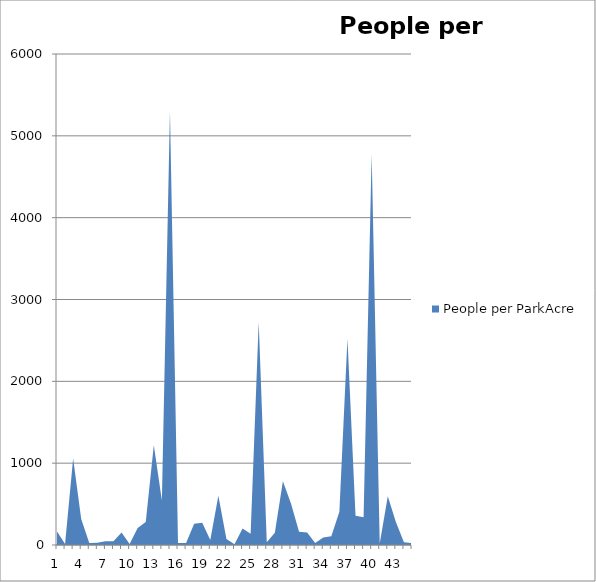
| Category | People per ParkAcre |
|---|---|
| 0 | 166.222 |
| 1 | 11.715 |
| 2 | 1057.923 |
| 3 | 316.927 |
| 4 | 24.488 |
| 5 | 26.723 |
| 6 | 46.502 |
| 7 | 45.991 |
| 8 | 151.634 |
| 9 | 11.04 |
| 10 | 206.359 |
| 11 | 279.823 |
| 12 | 1219.077 |
| 13 | 543.182 |
| 14 | 5302.315 |
| 15 | 23.995 |
| 16 | 23.17 |
| 17 | 261.053 |
| 18 | 270.855 |
| 19 | 59.758 |
| 20 | 602.741 |
| 21 | 73.906 |
| 22 | 9.429 |
| 23 | 202.133 |
| 24 | 138.482 |
| 25 | 2725.625 |
| 26 | 33.757 |
| 27 | 149.421 |
| 28 | 780.417 |
| 29 | 507.2 |
| 30 | 160.492 |
| 31 | 152.517 |
| 32 | 24.833 |
| 33 | 90.728 |
| 34 | 106.133 |
| 35 | 407.711 |
| 36 | 2519.171 |
| 37 | 356.25 |
| 38 | 338.235 |
| 39 | 4776.667 |
| 40 | 19 |
| 41 | 595 |
| 42 | 280 |
| 43 | 34.857 |
| 44 | 24.184 |